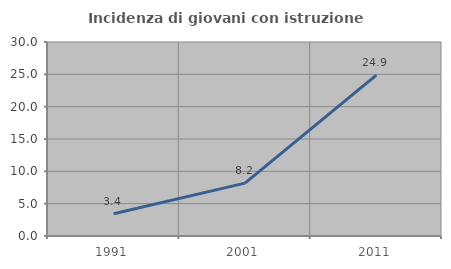
| Category | Incidenza di giovani con istruzione universitaria |
|---|---|
| 1991.0 | 3.448 |
| 2001.0 | 8.173 |
| 2011.0 | 24.885 |